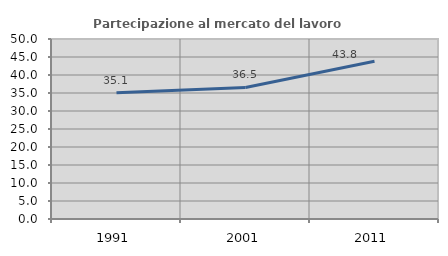
| Category | Partecipazione al mercato del lavoro  femminile |
|---|---|
| 1991.0 | 35.077 |
| 2001.0 | 36.533 |
| 2011.0 | 43.818 |